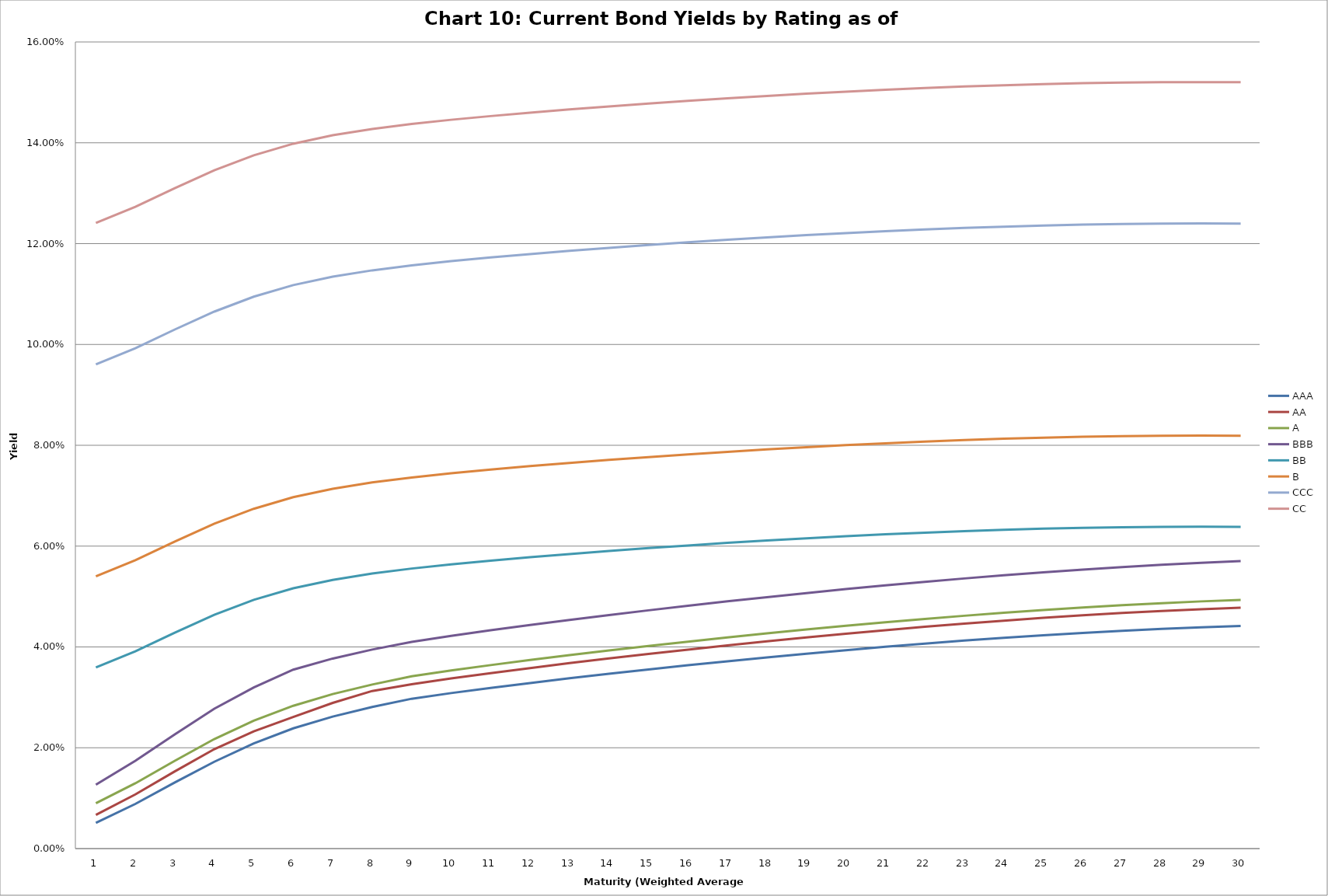
| Category | AAA | AA | A | BBB | BB | B | CCC | CC |
|---|---|---|---|---|---|---|---|---|
| 0 | 0.005 | 0.007 | 0.009 | 0.013 | 0.036 | 0.054 | 0.096 | 0.124 |
| 1 | 0.009 | 0.011 | 0.013 | 0.017 | 0.039 | 0.057 | 0.099 | 0.127 |
| 2 | 0.013 | 0.015 | 0.017 | 0.023 | 0.043 | 0.061 | 0.103 | 0.131 |
| 3 | 0.017 | 0.02 | 0.022 | 0.028 | 0.046 | 0.064 | 0.107 | 0.135 |
| 4 | 0.021 | 0.023 | 0.025 | 0.032 | 0.049 | 0.067 | 0.109 | 0.138 |
| 5 | 0.024 | 0.026 | 0.028 | 0.035 | 0.052 | 0.07 | 0.112 | 0.14 |
| 6 | 0.026 | 0.029 | 0.031 | 0.038 | 0.053 | 0.071 | 0.113 | 0.141 |
| 7 | 0.028 | 0.031 | 0.033 | 0.039 | 0.055 | 0.073 | 0.115 | 0.143 |
| 8 | 0.03 | 0.033 | 0.034 | 0.041 | 0.056 | 0.074 | 0.116 | 0.144 |
| 9 | 0.031 | 0.034 | 0.035 | 0.042 | 0.056 | 0.074 | 0.117 | 0.145 |
| 10 | 0.032 | 0.035 | 0.036 | 0.043 | 0.057 | 0.075 | 0.117 | 0.145 |
| 11 | 0.033 | 0.036 | 0.037 | 0.044 | 0.058 | 0.076 | 0.118 | 0.146 |
| 12 | 0.034 | 0.037 | 0.038 | 0.045 | 0.058 | 0.076 | 0.119 | 0.147 |
| 13 | 0.035 | 0.038 | 0.039 | 0.046 | 0.059 | 0.077 | 0.119 | 0.147 |
| 14 | 0.036 | 0.039 | 0.04 | 0.047 | 0.06 | 0.078 | 0.12 | 0.148 |
| 15 | 0.036 | 0.039 | 0.041 | 0.048 | 0.06 | 0.078 | 0.12 | 0.148 |
| 16 | 0.037 | 0.04 | 0.042 | 0.049 | 0.061 | 0.079 | 0.121 | 0.149 |
| 17 | 0.038 | 0.041 | 0.043 | 0.05 | 0.061 | 0.079 | 0.121 | 0.149 |
| 18 | 0.039 | 0.042 | 0.043 | 0.051 | 0.062 | 0.08 | 0.122 | 0.15 |
| 19 | 0.039 | 0.043 | 0.044 | 0.051 | 0.062 | 0.08 | 0.122 | 0.15 |
| 20 | 0.04 | 0.043 | 0.045 | 0.052 | 0.062 | 0.08 | 0.122 | 0.151 |
| 21 | 0.041 | 0.044 | 0.046 | 0.053 | 0.063 | 0.081 | 0.123 | 0.151 |
| 22 | 0.041 | 0.045 | 0.046 | 0.054 | 0.063 | 0.081 | 0.123 | 0.151 |
| 23 | 0.042 | 0.045 | 0.047 | 0.054 | 0.063 | 0.081 | 0.123 | 0.151 |
| 24 | 0.042 | 0.046 | 0.047 | 0.055 | 0.063 | 0.082 | 0.124 | 0.152 |
| 25 | 0.043 | 0.046 | 0.048 | 0.055 | 0.064 | 0.082 | 0.124 | 0.152 |
| 26 | 0.043 | 0.047 | 0.048 | 0.056 | 0.064 | 0.082 | 0.124 | 0.152 |
| 27 | 0.044 | 0.047 | 0.049 | 0.056 | 0.064 | 0.082 | 0.124 | 0.152 |
| 28 | 0.044 | 0.047 | 0.049 | 0.057 | 0.064 | 0.082 | 0.124 | 0.152 |
| 29 | 0.044 | 0.048 | 0.049 | 0.057 | 0.064 | 0.082 | 0.124 | 0.152 |